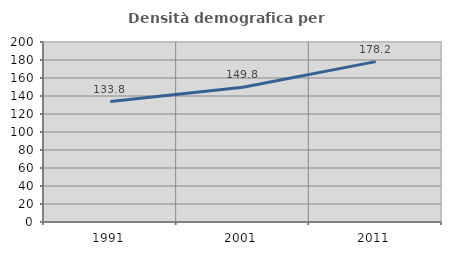
| Category | Densità demografica |
|---|---|
| 1991.0 | 133.835 |
| 2001.0 | 149.809 |
| 2011.0 | 178.204 |